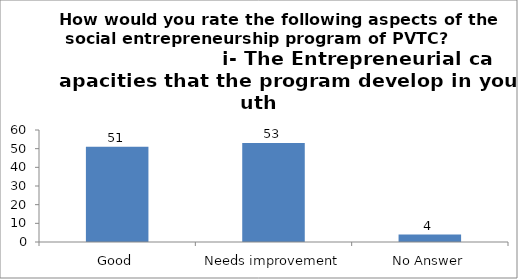
| Category | How would you rate the following aspects of the Social Entrepreneurship program of PVTC? i- The Entrepreneurial capacities that the program develop in youth  |
|---|---|
| Good | 51 |
| Needs improvement | 53 |
| No Answer | 4 |